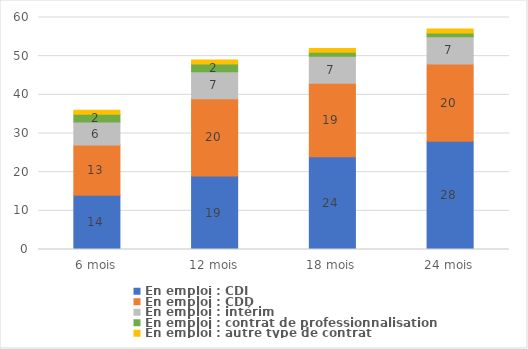
| Category | En emploi : CDI | En emploi : CDD | En emploi : intérim | En emploi : contrat de professionnalisation | En emploi : autre type de contrat |
|---|---|---|---|---|---|
| 6 mois | 14 | 13 | 6 | 2 | 1 |
| 12 mois | 19 | 20 | 7 | 2 | 1 |
| 18 mois | 24 | 19 | 7 | 1 | 1 |
| 24 mois | 28 | 20 | 7 | 1 | 1 |